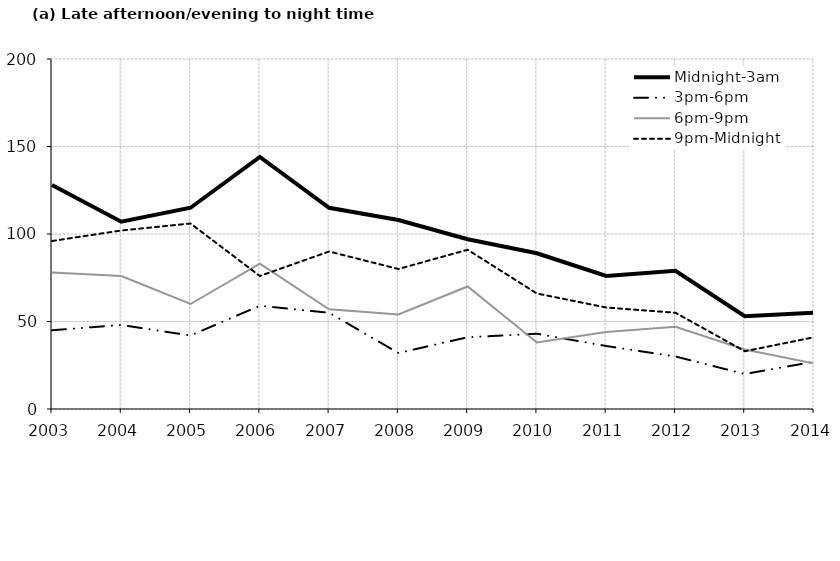
| Category | Midnight-3am | 3pm-6pm | 6pm-9pm | 9pm-Midnight |
|---|---|---|---|---|
| 2003.0 | 128 | 45 | 78 | 96 |
| 2004.0 | 107 | 48 | 76 | 102 |
| 2005.0 | 115 | 42 | 60 | 106 |
| 2006.0 | 144 | 59 | 83 | 76 |
| 2007.0 | 115 | 55 | 57 | 90 |
| 2008.0 | 108 | 32 | 54 | 80 |
| 2009.0 | 97 | 41 | 70 | 91 |
| 2010.0 | 89 | 43 | 38 | 66 |
| 2011.0 | 76 | 36 | 44 | 58 |
| 2012.0 | 79 | 30 | 47 | 55 |
| 2013.0 | 53 | 20 | 34 | 33 |
| 2014.0 | 55 | 27 | 26 | 41 |